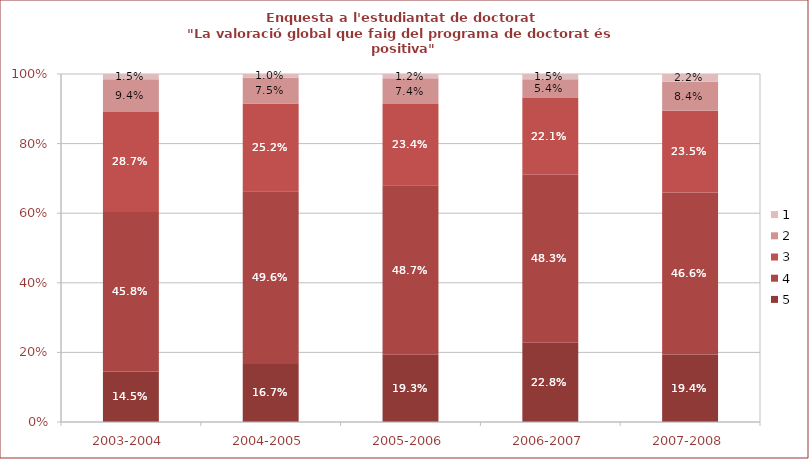
| Category | 5 | 4 | 3 | 2 | 1 |
|---|---|---|---|---|---|
| 2003-2004 | 0.145 | 0.458 | 0.287 | 0.094 | 0.015 |
| 2004-2005 | 0.167 | 0.496 | 0.252 | 0.075 | 0.01 |
| 2005-2006 | 0.193 | 0.487 | 0.234 | 0.074 | 0.012 |
| 2006-2007 | 0.228 | 0.483 | 0.221 | 0.054 | 0.015 |
| 2007-2008 | 0.194 | 0.466 | 0.235 | 0.084 | 0.022 |